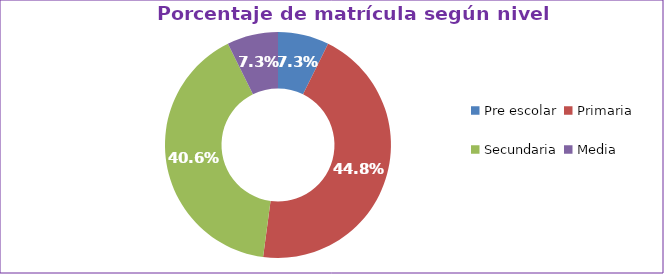
| Category | Series 0 |
|---|---|
| Pre escolar | 0.073 |
| Primaria | 0.448 |
| Secundaria | 0.406 |
| Media | 0.073 |